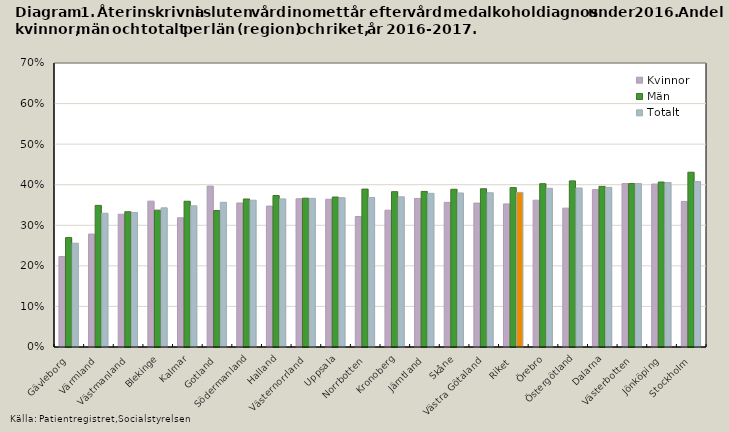
| Category | Kvinnor | Män | Totalt |
|---|---|---|---|
| Gävleborg | 0.223 | 0.27 | 0.256 |
| Värmland | 0.278 | 0.349 | 0.33 |
| Västmanland | 0.327 | 0.333 | 0.332 |
| Blekinge | 0.36 | 0.337 | 0.343 |
| Kalmar | 0.318 | 0.359 | 0.348 |
| Gotland | 0.397 | 0.336 | 0.357 |
| Södermanland | 0.355 | 0.365 | 0.362 |
| Halland | 0.347 | 0.373 | 0.365 |
| Västernorrland | 0.365 | 0.367 | 0.366 |
| Uppsala | 0.364 | 0.37 | 0.368 |
| Norrbotten | 0.322 | 0.389 | 0.369 |
| Kronoberg | 0.337 | 0.383 | 0.37 |
| Jämtland | 0.366 | 0.383 | 0.379 |
| Skåne | 0.357 | 0.389 | 0.38 |
| Västra Götaland | 0.355 | 0.39 | 0.38 |
| Riket | 0.353 | 0.393 | 0.381 |
| Örebro | 0.362 | 0.403 | 0.391 |
| Östergötland | 0.342 | 0.409 | 0.392 |
| Dalarna | 0.388 | 0.396 | 0.393 |
| Västerbotten | 0.403 | 0.403 | 0.403 |
| Jönköping | 0.402 | 0.407 | 0.405 |
| Stockholm | 0.359 | 0.431 | 0.408 |